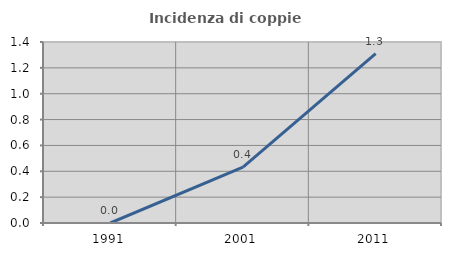
| Category | Incidenza di coppie miste |
|---|---|
| 1991.0 | 0 |
| 2001.0 | 0.433 |
| 2011.0 | 1.31 |